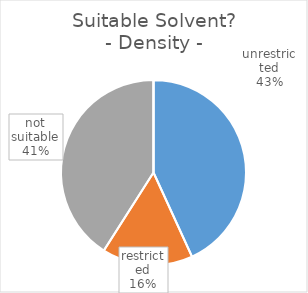
| Category | Series 0 |
|---|---|
| 0 | 79 |
| 1 | 29 |
| 2 | 75 |
| 3 | 0 |